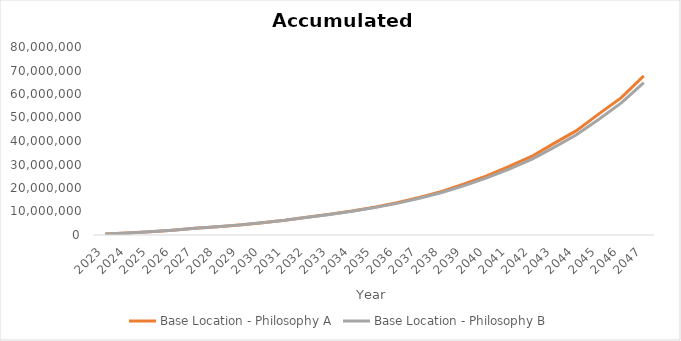
| Category | Base Location - Philosophy A | Base Location - Philosophy B |
|---|---|---|
| 2023.0 | 385607.085 | 394728.399 |
| 2024.0 | 842071.318 | 854137.712 |
| 2025.0 | 1396823.129 | 1415755.662 |
| 2026.0 | 2048956.778 | 2071038.649 |
| 2027.0 | 2858967.928 | 2894373.875 |
| 2028.0 | 3505832.702 | 3546994.016 |
| 2029.0 | 4264015.17 | 4308148.19 |
| 2030.0 | 5208857.668 | 5246972.911 |
| 2031.0 | 6238139.699 | 6277130.107 |
| 2032.0 | 7558607.68 | 7553157.874 |
| 2033.0 | 8811667.154 | 8740346.66 |
| 2034.0 | 10197327.728 | 10085109.586 |
| 2035.0 | 11802135.28 | 11644084.655 |
| 2036.0 | 13697227.704 | 13467672.908 |
| 2037.0 | 15989035.099 | 15625361.251 |
| 2038.0 | 18552730.857 | 18074933.912 |
| 2039.0 | 21747779.068 | 21014297.372 |
| 2040.0 | 25184209.972 | 24277428.442 |
| 2041.0 | 29153026.175 | 28034808.563 |
| 2042.0 | 33424741.823 | 32207659.632 |
| 2043.0 | 38990130.711 | 37310601.633 |
| 2044.0 | 44394172.64 | 42681572.194 |
| 2045.0 | 51541452.946 | 49284072.073 |
| 2046.0 | 58443225.703 | 56211651.887 |
| 2047.0 | 67743056.118 | 64794174.787 |